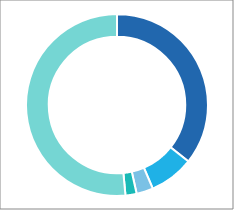
| Category | Series 0 |
|---|---|
| ● North America hurricane | 0.36 |
| ● Europe wind | 0.08 |
| ● Europe flood | 0.03 |
| ● Other climate-related | 0.02 |
| ● Non-climate related | 0.52 |